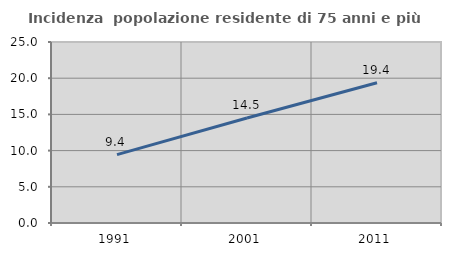
| Category | Incidenza  popolazione residente di 75 anni e più |
|---|---|
| 1991.0 | 9.44 |
| 2001.0 | 14.494 |
| 2011.0 | 19.38 |